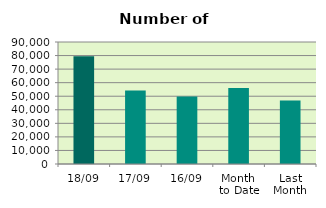
| Category | Series 0 |
|---|---|
| 18/09 | 79504 |
| 17/09 | 54198 |
| 16/09 | 49864 |
| Month 
to Date | 56154 |
| Last
Month | 46763.238 |